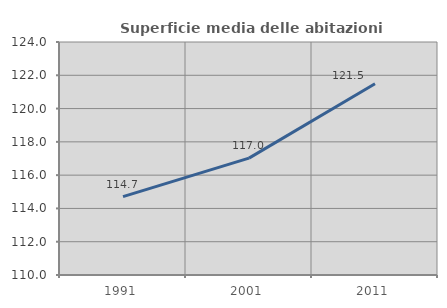
| Category | Superficie media delle abitazioni occupate |
|---|---|
| 1991.0 | 114.712 |
| 2001.0 | 117.025 |
| 2011.0 | 121.495 |